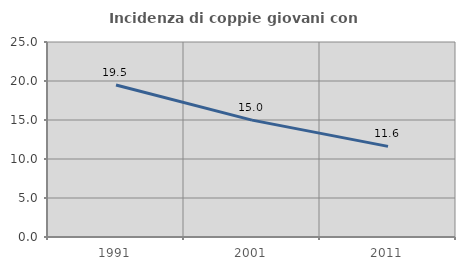
| Category | Incidenza di coppie giovani con figli |
|---|---|
| 1991.0 | 19.495 |
| 2001.0 | 14.984 |
| 2011.0 | 11.621 |